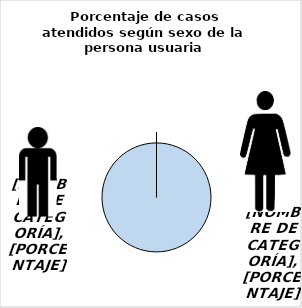
| Category | Series 0 |
|---|---|
| Mujer | 1 |
| Hombre | 0 |